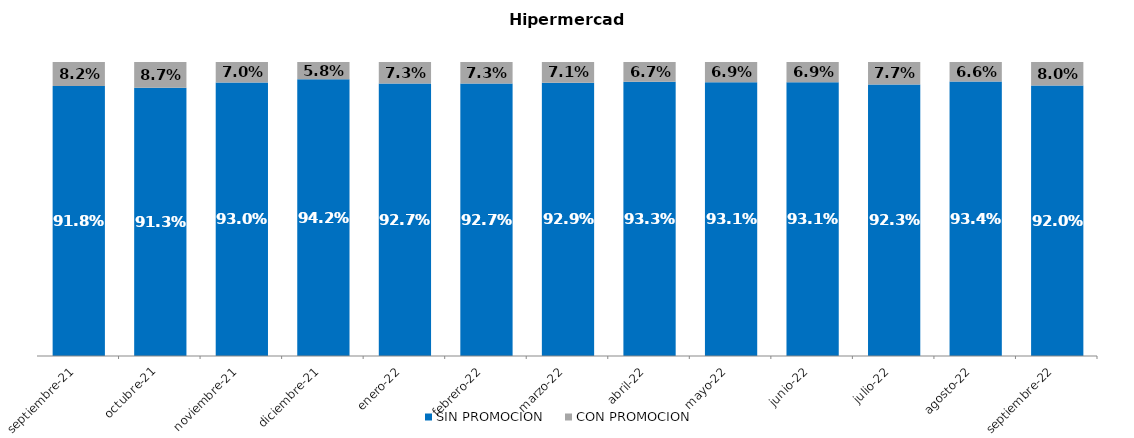
| Category | SIN PROMOCION   | CON PROMOCION   |
|---|---|---|
| 2021-09-01 | 0.918 | 0.082 |
| 2021-10-01 | 0.913 | 0.087 |
| 2021-11-01 | 0.93 | 0.07 |
| 2021-12-01 | 0.942 | 0.058 |
| 2022-01-01 | 0.927 | 0.073 |
| 2022-02-01 | 0.927 | 0.073 |
| 2022-03-01 | 0.929 | 0.071 |
| 2022-04-01 | 0.933 | 0.067 |
| 2022-05-01 | 0.931 | 0.069 |
| 2022-06-01 | 0.931 | 0.069 |
| 2022-07-01 | 0.923 | 0.077 |
| 2022-08-01 | 0.934 | 0.066 |
| 2022-09-01 | 0.92 | 0.08 |